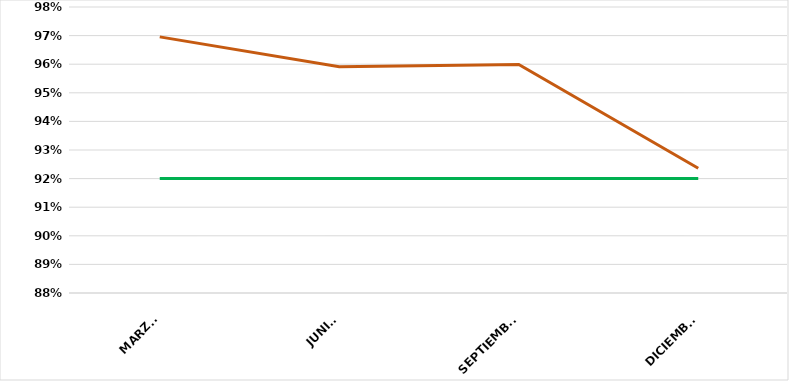
| Category | VALOR  | META PONDERADA |
|---|---|---|
| MARZO | 0.97 | 0.92 |
| JUNIO | 0.959 | 0.92 |
| SEPTIEMBRE | 0.96 | 0.92 |
| DICIEMBRE | 0.924 | 0.92 |